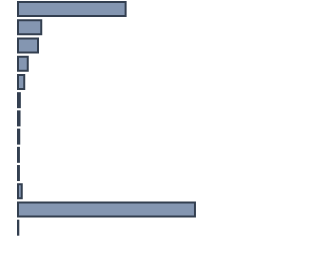
| Category | Series 0 |
|---|---|
| 0 | 34.6 |
| 1 | 7.5 |
| 2 | 6.4 |
| 3 | 3.1 |
| 4 | 2 |
| 5 | 0.6 |
| 6 | 0.5 |
| 7 | 0.4 |
| 8 | 0.3 |
| 9 | 0.3 |
| 10 | 1.2 |
| 11 | 56.9 |
| 12 | 0.1 |
| 13 | 0 |